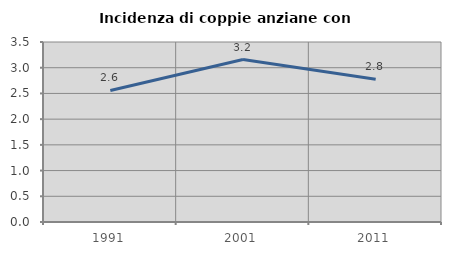
| Category | Incidenza di coppie anziane con figli |
|---|---|
| 1991.0 | 2.558 |
| 2001.0 | 3.159 |
| 2011.0 | 2.774 |